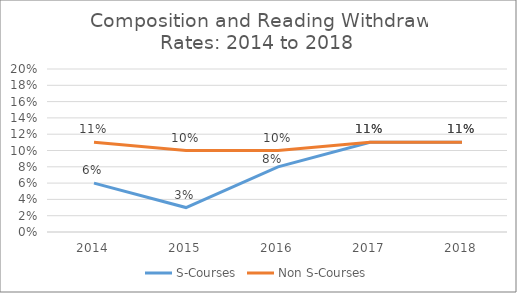
| Category | S-Courses | Non S-Courses |
|---|---|---|
| 2014.0 | 0.06 | 0.11 |
| 2015.0 | 0.03 | 0.1 |
| 2016.0 | 0.08 | 0.1 |
| 2017.0 | 0.11 | 0.11 |
| 2018.0 | 0.11 | 0.11 |